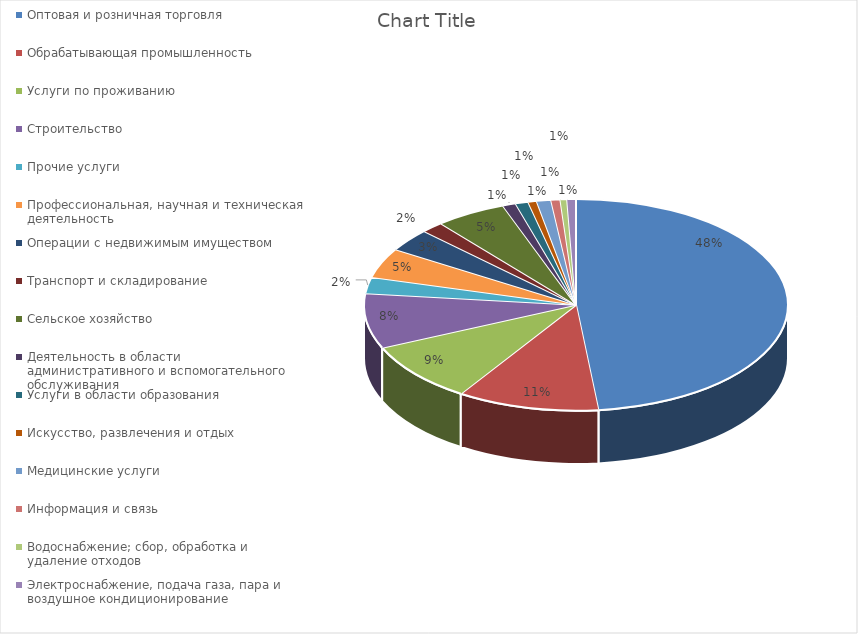
| Category | Series 0 |
|---|---|
| Оптовая и розничная торговля | 0.483 |
| Обрабатывающая промышленность | 0.108 |
| Услуги по проживанию | 0.092 |
| Строительство | 0.084 |
| Прочие услуги | 0.025 |
| Профессиональная, научная и техническая деятельность | 0.045 |
| Операции с недвижимым имуществом | 0.035 |
| Транспорт и складирование | 0.017 |
| Сельское хозяйство | 0.054 |
| Деятельность в области административного и вспомогательного обслуживания | 0.01 |
| Услуги в области образования | 0.01 |
| Искусство, развлечения и отдых | 0.006 |
| Медицинские услуги | 0.011 |
| Информация и связь | 0.007 |
| Водоснабжение; сбор, обработка и удаление отходов | 0.005 |
| Электроснабжение, подача газа, пара и воздушное кондиционирование | 0.007 |